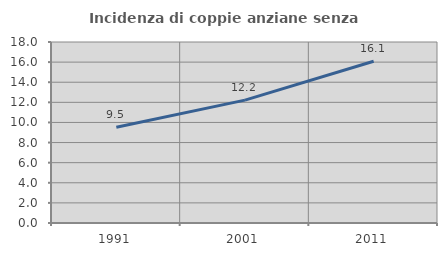
| Category | Incidenza di coppie anziane senza figli  |
|---|---|
| 1991.0 | 9.529 |
| 2001.0 | 12.217 |
| 2011.0 | 16.08 |